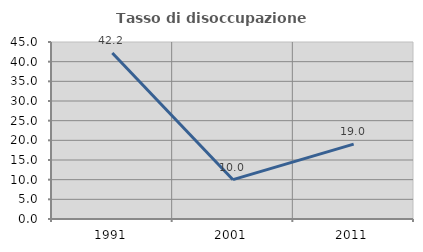
| Category | Tasso di disoccupazione giovanile  |
|---|---|
| 1991.0 | 42.222 |
| 2001.0 | 10 |
| 2011.0 | 19.048 |